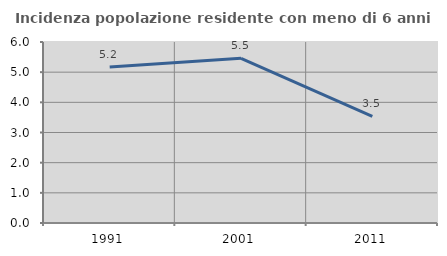
| Category | Incidenza popolazione residente con meno di 6 anni |
|---|---|
| 1991.0 | 5.171 |
| 2001.0 | 5.459 |
| 2011.0 | 3.536 |